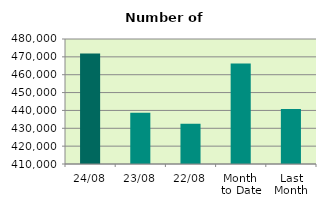
| Category | Series 0 |
|---|---|
| 24/08 | 471814 |
| 23/08 | 438708 |
| 22/08 | 432540 |
| Month 
to Date | 466265.778 |
| Last
Month | 440756.667 |